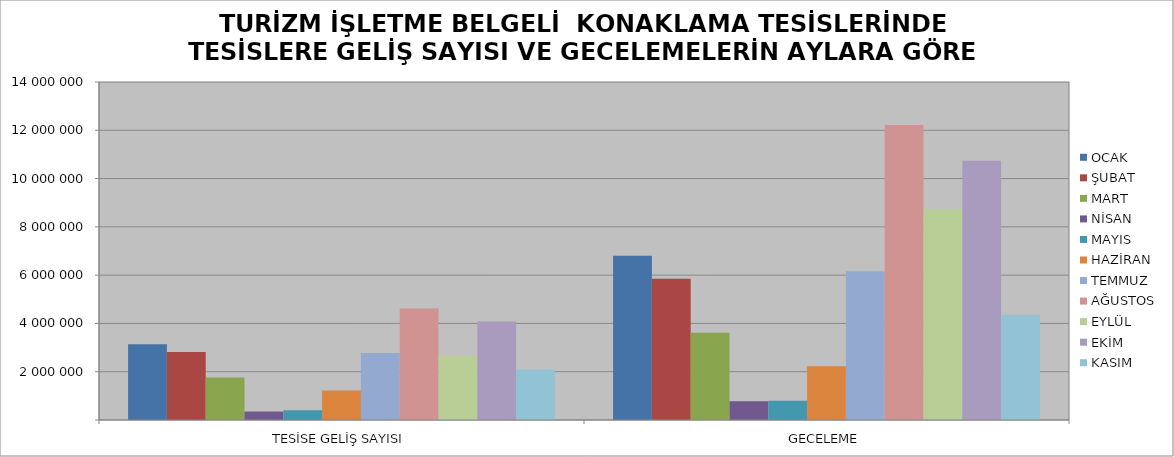
| Category | OCAK | ŞUBAT | MART | NİSAN | MAYIS | HAZİRAN | TEMMUZ | AĞUSTOS | EYLÜL | EKİM | KASIM |
|---|---|---|---|---|---|---|---|---|---|---|---|
| TESİSE GELİŞ SAYISI | 3140857 | 2816145 | 1756166 | 346964 | 400777 | 1222339 | 2777113 | 4617108 | 2662829 | 4080440 | 2090089 |
| GECELEME | 6806196 | 5853519 | 3616071 | 781724 | 800953 | 2221474 | 6159447 | 12220419 | 8734576 | 10738693 | 4356780 |